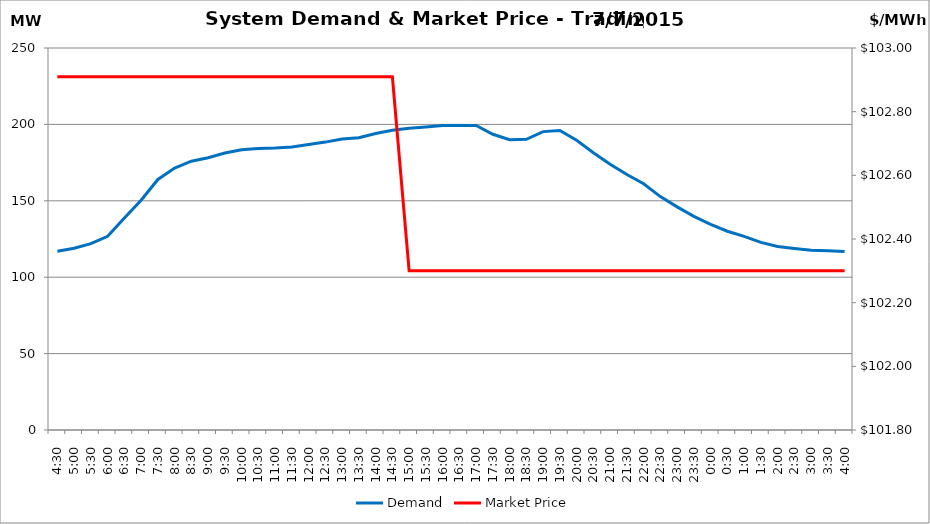
| Category | Demand |
|---|---|
| 0.1875 | 116.97 |
| 0.20833333333333334 | 118.96 |
| 0.22916666666666666 | 121.92 |
| 0.25 | 126.76 |
| 0.270833333333333 | 138.7 |
| 0.291666666666667 | 150.35 |
| 0.3125 | 163.97 |
| 0.333333333333333 | 171.43 |
| 0.354166666666667 | 175.91 |
| 0.375 | 178.14 |
| 0.395833333333333 | 181.23 |
| 0.416666666666667 | 183.41 |
| 0.4375 | 184.18 |
| 0.458333333333333 | 184.52 |
| 0.479166666666667 | 185.18 |
| 0.5 | 186.89 |
| 0.520833333333333 | 188.41 |
| 0.541666666666667 | 190.41 |
| 0.5625 | 191.31 |
| 0.583333333333333 | 194.07 |
| 0.604166666666667 | 196.19 |
| 0.625 | 197.48 |
| 0.645833333333334 | 198.3 |
| 0.666666666666667 | 199.28 |
| 0.6875 | 199.2 |
| 0.708333333333334 | 199.33 |
| 0.729166666666667 | 193.56 |
| 0.75 | 189.97 |
| 0.770833333333334 | 190.24 |
| 0.791666666666667 | 195.27 |
| 0.8125 | 196 |
| 0.833333333333334 | 189.67 |
| 0.854166666666667 | 181.47 |
| 0.875 | 173.93 |
| 0.895833333333334 | 167.25 |
| 0.916666666666667 | 161.17 |
| 0.9375 | 152.73 |
| 0.958333333333334 | 146.02 |
| 0.979166666666667 | 139.78 |
| 1900-01-01 | 134.54 |
| 1900-01-01 00:30:00 | 130.09 |
| 1900-01-01 01:00:00 | 126.69 |
| 1900-01-01 01:30:00 | 122.77 |
| 1900-01-01 02:00:00 | 120.14 |
| 1900-01-01 02:30:00 | 118.8 |
| 1900-01-01 03:00:00 | 117.61 |
| 1900-01-01 03:30:00 | 117.28 |
| 1900-01-01 04:00:00 | 116.82 |